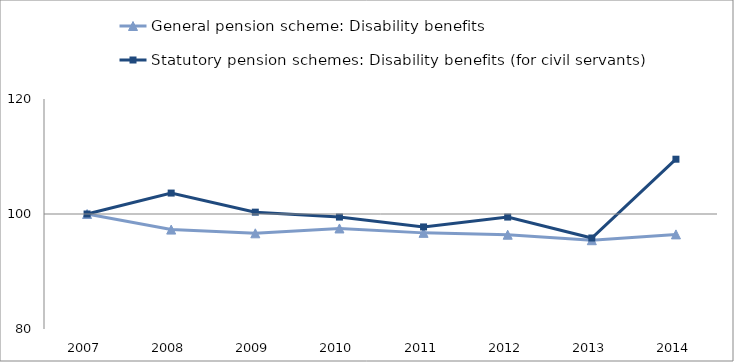
| Category | General pension scheme: Disability benefits | Statutory pension schemes: Disability benefits (for civil servants) |
|---|---|---|
| 2007.0 | 100 | 100 |
| 2008.0 | 97.29 | 103.64 |
| 2009.0 | 96.643 | 100.321 |
| 2010.0 | 97.484 | 99.465 |
| 2011.0 | 96.718 | 97.752 |
| 2012.0 | 96.398 | 99.465 |
| 2013.0 | 95.443 | 95.824 |
| 2014.0 | 96.455 | 109.529 |